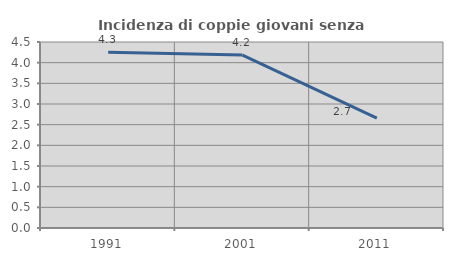
| Category | Incidenza di coppie giovani senza figli |
|---|---|
| 1991.0 | 4.251 |
| 2001.0 | 4.183 |
| 2011.0 | 2.661 |